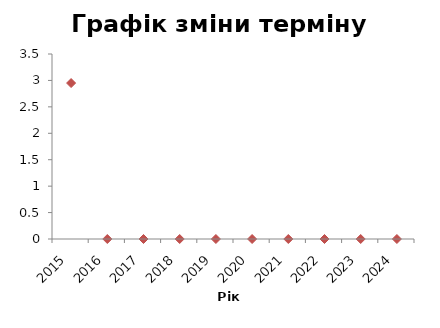
| Category | Series 0 |
|---|---|
| 2015.0 | 2.95 |
| 2016.0 | 0 |
| 2017.0 | 0 |
| 2018.0 | 0 |
| 2019.0 | 0 |
| 2020.0 | 0 |
| 2021.0 | 0 |
| 2022.0 | 0 |
| 2023.0 | 0 |
| 2024.0 | 0 |